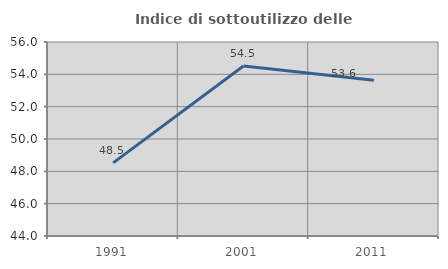
| Category | Indice di sottoutilizzo delle abitazioni  |
|---|---|
| 1991.0 | 48.525 |
| 2001.0 | 54.518 |
| 2011.0 | 53.636 |